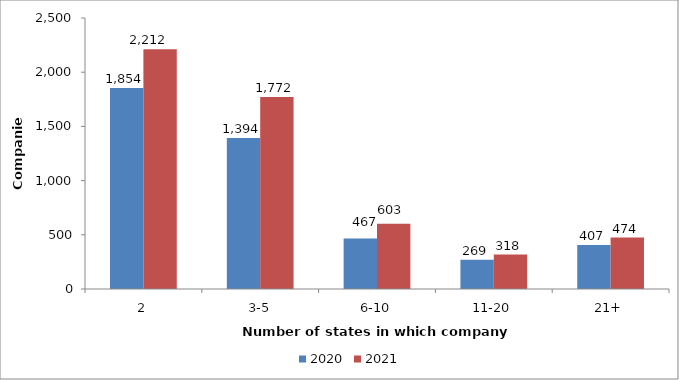
| Category | 2020 | 2021 |
|---|---|---|
| 2 | 1854 | 2212 |
| 3-5 | 1394 | 1772 |
| 6-10 | 467 | 603 |
| 11-20 | 269 | 318 |
| 21+ | 407 | 474 |